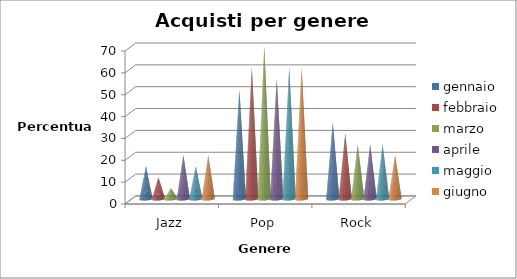
| Category | gennaio | febbraio | marzo | aprile | maggio | giugno |
|---|---|---|---|---|---|---|
| Jazz | 15 | 10 | 5 | 20 | 15 | 20 |
| Pop | 50 | 60 | 70 | 55 | 60 | 60 |
| Rock | 35 | 30 | 25 | 25 | 25 | 20 |